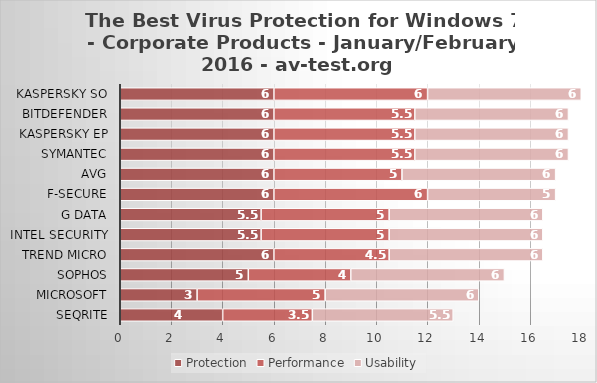
| Category | Protection | Performance | Usability |
|---|---|---|---|
| Seqrite | 4 | 3.5 | 5.5 |
| Microsoft | 3 | 5 | 6 |
| Sophos | 5 | 4 | 6 |
| Trend Micro | 6 | 4.5 | 6 |
| Intel Security | 5.5 | 5 | 6 |
| G Data | 5.5 | 5 | 6 |
| F-Secure | 6 | 6 | 5 |
| AVG | 6 | 5 | 6 |
| Symantec | 6 | 5.5 | 6 |
| Kaspersky EP | 6 | 5.5 | 6 |
| Bitdefender | 6 | 5.5 | 6 |
| Kaspersky SO | 6 | 6 | 6 |